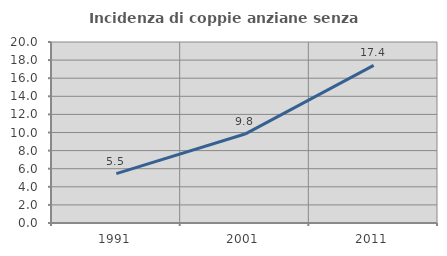
| Category | Incidenza di coppie anziane senza figli  |
|---|---|
| 1991.0 | 5.455 |
| 2001.0 | 9.828 |
| 2011.0 | 17.422 |